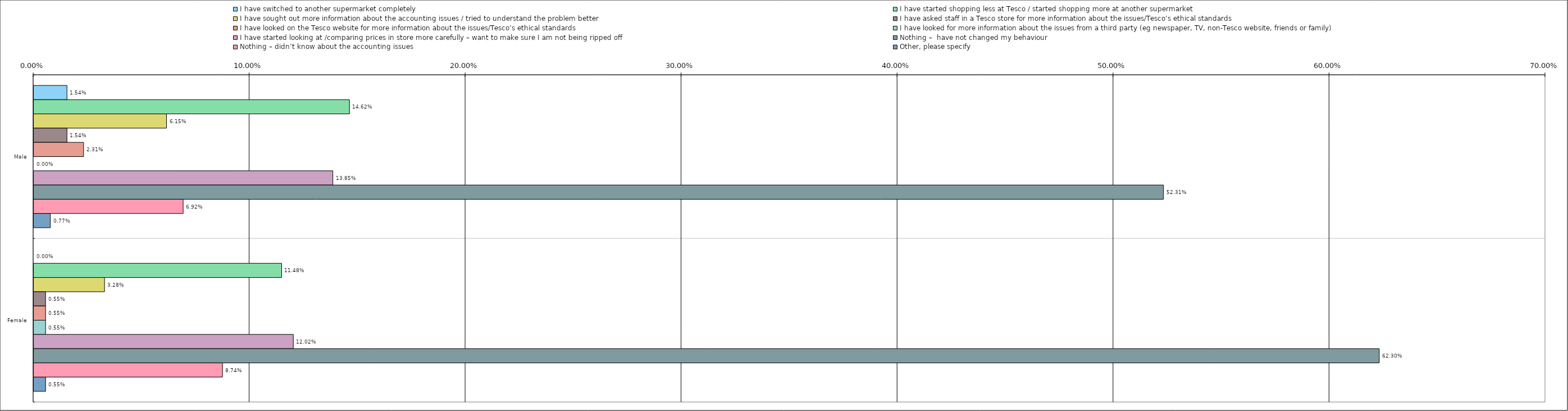
| Category | I have switched to another supermarket completely | I have started shopping less at Tesco / started shopping more at another supermarket | I have sought out more information about the accounting issues / tried to understand the problem better | I have asked staff in a Tesco store for more information about the issues/Tesco’s ethical standards | I have looked on the Tesco website for more information about the issues/Tesco’s ethical standards | I have looked for more information about the issues from a third party (eg newspaper, TV, non-Tesco website, friends or family) | I have started looking at /comparing prices in store more carefully – want to make sure I am not being ripped off | Nothing –  have not changed my behaviour | Nothing – didn’t know about the accounting issues | Other, please specify |
|---|---|---|---|---|---|---|---|---|---|---|
| 0 | 0.015 | 0.146 | 0.062 | 0.015 | 0.023 | 0 | 0.138 | 0.523 | 0.069 | 0.008 |
| 1 | 0 | 0.115 | 0.033 | 0.006 | 0.006 | 0.006 | 0.12 | 0.623 | 0.087 | 0.006 |